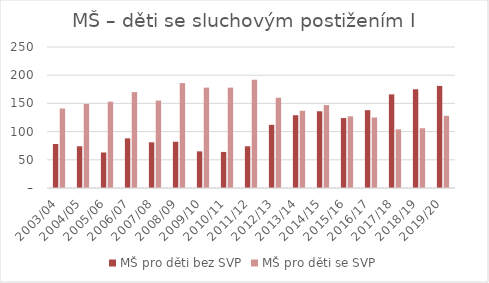
| Category | MŠ pro děti bez SVP | MŠ pro děti se SVP |
|---|---|---|
| 2003/04 | 78 | 141 |
| 2004/05 | 74 | 149 |
| 2005/06 | 63 | 153 |
| 2006/07 | 88 | 170 |
| 2007/08 | 81 | 155 |
| 2008/09 | 82 | 186 |
| 2009/10 | 65 | 178 |
| 2010/11 | 64 | 178 |
| 2011/12 | 74 | 192 |
| 2012/13 | 112 | 160 |
| 2013/14 | 129 | 137 |
| 2014/15 | 136 | 147 |
| 2015/16 | 124 | 127 |
| 2016/17 | 138 | 125 |
| 2017/18 | 166 | 104 |
| 2018/19 | 175 | 106 |
| 2019/20 | 181 | 128 |